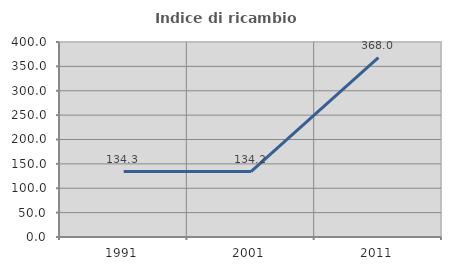
| Category | Indice di ricambio occupazionale  |
|---|---|
| 1991.0 | 134.286 |
| 2001.0 | 134.211 |
| 2011.0 | 368 |